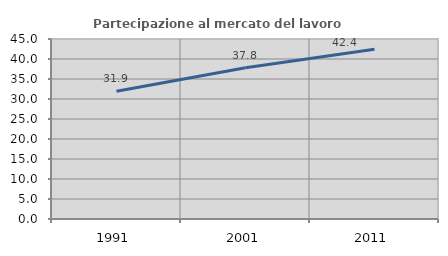
| Category | Partecipazione al mercato del lavoro  femminile |
|---|---|
| 1991.0 | 31.929 |
| 2001.0 | 37.816 |
| 2011.0 | 42.43 |